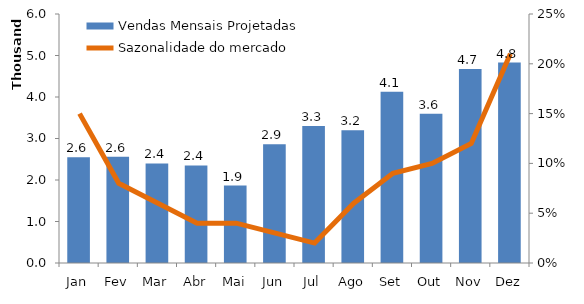
| Category | Vendas Mensais Projetadas |
|---|---|
| Jan | 2550 |
| Fev | 2561 |
| Mar | 2400 |
| Abr | 2350 |
| Mai | 1866 |
| Jun | 2859 |
| Jul | 3299 |
| Ago | 3200 |
| Set | 4127 |
| Out | 3599 |
| Nov | 4677 |
| Dez | 4829 |